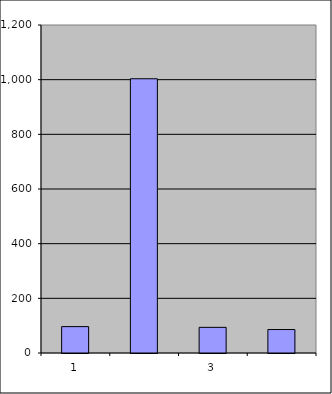
| Category | Series 0 |
|---|---|
| 0 | 96.5 |
| 1 | 1003.337 |
| 2 | 93.836 |
| 3 | 85.816 |